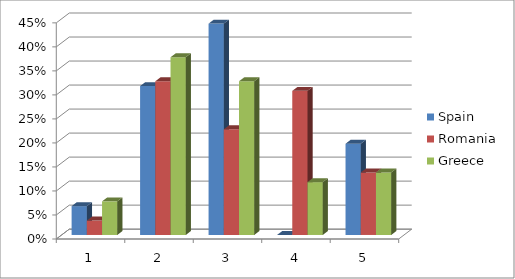
| Category | Spain | Romania | Greece |
|---|---|---|---|
| 0 | 0.06 | 0.03 | 0.07 |
| 1 | 0.31 | 0.32 | 0.37 |
| 2 | 0.44 | 0.22 | 0.32 |
| 3 | 0 | 0.3 | 0.11 |
| 4 | 0.19 | 0.13 | 0.13 |